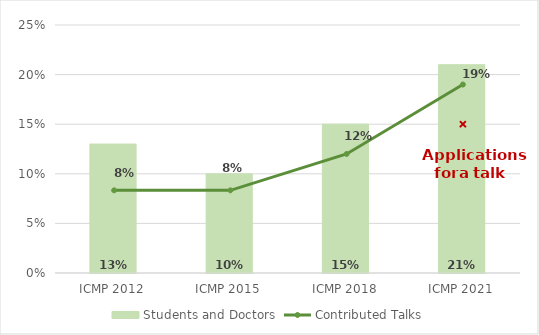
| Category | Students and Doctors |
|---|---|
| ICMP 2012 | 0.13 |
| ICMP 2015 | 0.1 |
| ICMP 2018 | 0.15 |
| ICMP 2021 | 0.21 |